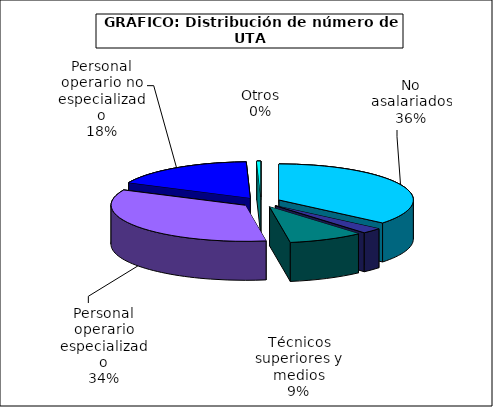
| Category | Series 0 |
|---|---|
| No asalariados | 2059.047 |
| Administrativos | 143.066 |
| Técnicos superiores y medios | 517.308 |
| Personal operario especializado | 1971.407 |
| Personal operario no especializado | 1003.529 |
| Otros | 27.387 |